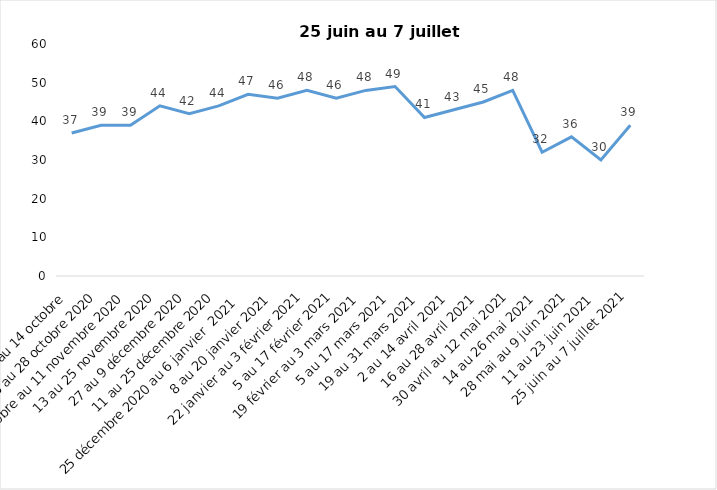
| Category | Toujours aux trois mesures |
|---|---|
| 2 au 14 octobre  | 37 |
| 16 au 28 octobre 2020 | 39 |
| 30 octobre au 11 novembre 2020 | 39 |
| 13 au 25 novembre 2020 | 44 |
| 27 au 9 décembre 2020 | 42 |
| 11 au 25 décembre 2020 | 44 |
| 25 décembre 2020 au 6 janvier  2021 | 47 |
| 8 au 20 janvier 2021 | 46 |
| 22 janvier au 3 février 2021 | 48 |
| 5 au 17 février 2021 | 46 |
| 19 février au 3 mars 2021 | 48 |
| 5 au 17 mars 2021 | 49 |
| 19 au 31 mars 2021 | 41 |
| 2 au 14 avril 2021 | 43 |
| 16 au 28 avril 2021 | 45 |
| 30 avril au 12 mai 2021 | 48 |
| 14 au 26 mai 2021 | 32 |
| 28 mai au 9 juin 2021 | 36 |
| 11 au 23 juin 2021 | 30 |
| 25 juin au 7 juillet 2021 | 39 |